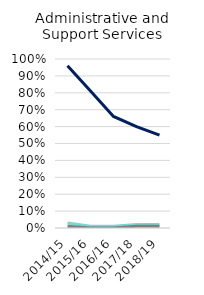
| Category | Employed | Self-Employed | Both |
|---|---|---|---|
| 2014/15 | 0.96 | 0.03 | 0.01 |
| 2015/16 | 0.81 | 0.01 | 0 |
| 2016/16 | 0.66 | 0.01 | 0 |
| 2017/18 | 0.6 | 0.02 | 0.01 |
| 2018/19 | 0.55 | 0.02 | 0.01 |